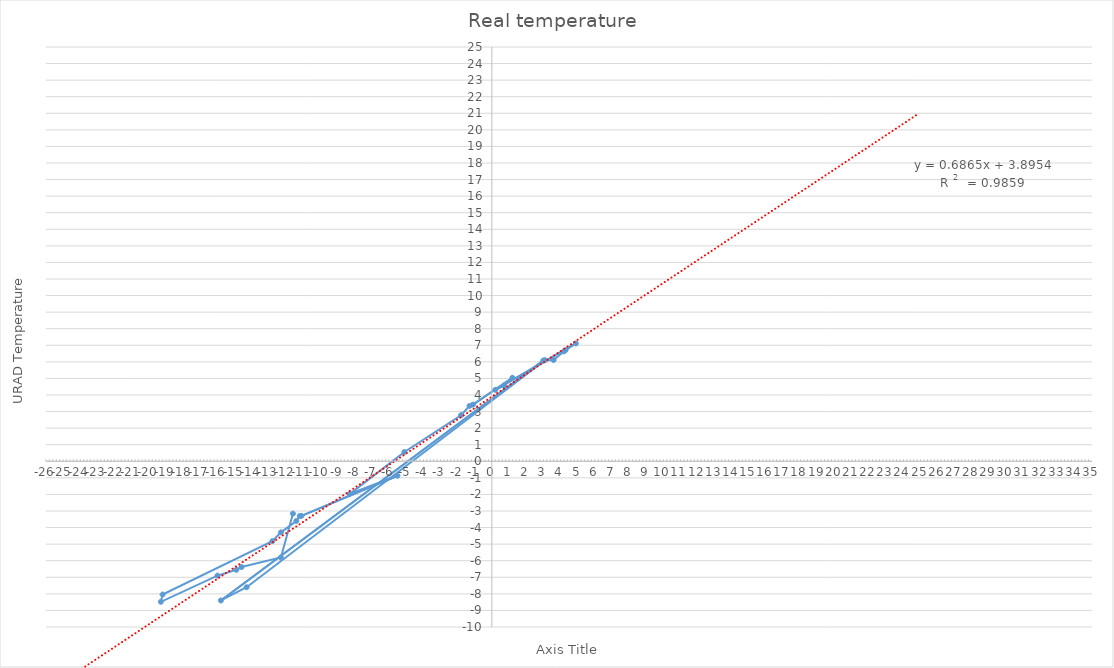
| Category | y(urad) |
|---|---|
| 3.1 | 6.1 |
| -14.3 | -7.6 |
| -15.8 | -8.4 |
| 3.0 | 6.08 |
| 3.6 | 6.11 |
| 4.2 | 6.63 |
| 4.3 | 6.71 |
| 4.9 | 7.11 |
| 0.2 | 4.31 |
| 0.7 | 4.57 |
| 1.2 | 5.04 |
| -1.1 | 3.42 |
| -1.3 | 3.34 |
| -1.8 | 2.78 |
| -5.1 | 0.56 |
| -8.3 | -1.98 |
| -5.5 | -0.87 |
| -11.1 | -3.29 |
| -11.2 | -3.3 |
| -11.4 | -3.6 |
| -12.3 | -4.29 |
| -12.8 | -4.82 |
| -19.2 | -8.04 |
| -19.3 | -8.48 |
| -16.0 | -6.9 |
| -14.9 | -6.55 |
| -14.6 | -6.38 |
| -12.3 | -5.8 |
| -11.6 | -3.16 |